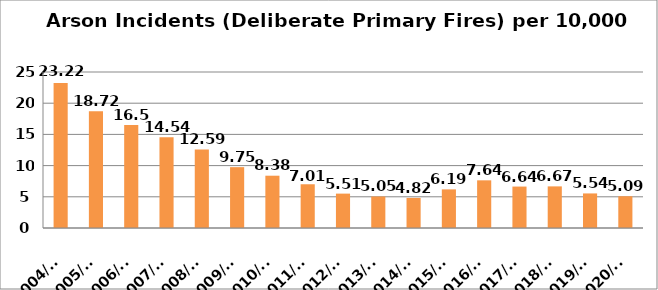
| Category | Series 0 |
|---|---|
| 2004/05 | 23.22 |
| 2005/06 | 18.72 |
| 2006/07 | 16.5 |
| 2007/08 | 14.54 |
| 2008/09 | 12.59 |
| 2009/10 | 9.75 |
| 2010/11 | 8.38 |
| 2011/12 | 7.01 |
| 2012/13 | 5.51 |
| 2013/14 | 5.05 |
| 2014/15 | 4.82 |
| 2015/16 | 6.19 |
| 2016/17 | 7.64 |
| 2017/18 | 6.64 |
| 2018/19 | 6.67 |
| 2019/20 | 5.54 |
| 2020/21 | 5.09 |